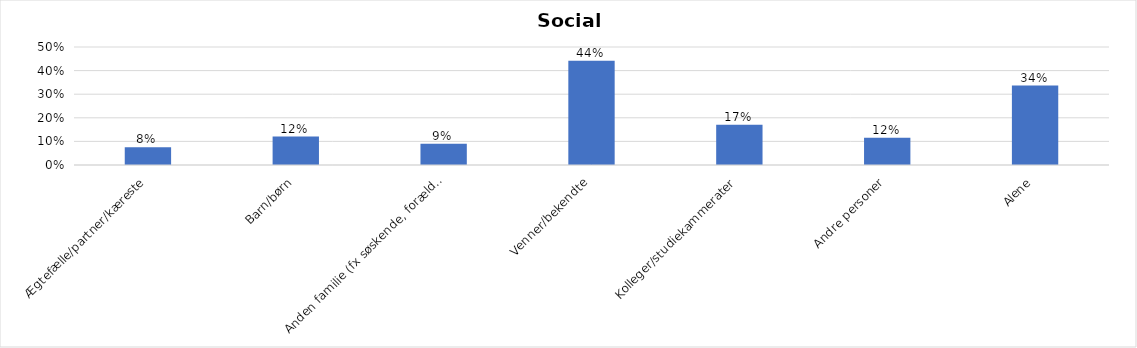
| Category | % |
|---|---|
| Ægtefælle/partner/kæreste | 0.075 |
| Barn/børn | 0.121 |
| Anden familie (fx søskende, forældre) | 0.09 |
| Venner/bekendte | 0.442 |
| Kolleger/studiekammerater | 0.171 |
| Andre personer | 0.116 |
| Alene | 0.337 |